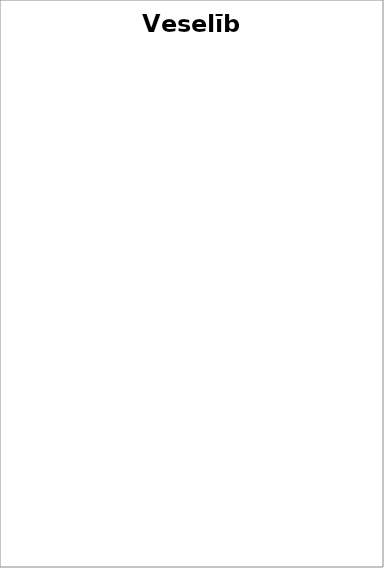
| Category | Veselība |
|---|---|
| Maksas par veselības aprūpes pakalpojumiem ko sniedz ārstniecības iestādes | 0 |
| Sociālās drošības tīkla pasākumi | 0 |
| Neatliekamā medicīnas palīdzība | 0.035 |
| Sabiedrības veselības dienestu pakalpojumi | 0.037 |
| Medikamentu un materiālu iegāde, KF militāro pensionāru aprūpe, ē-veselība un interešu izglītība | 0.048 |
| Veselības aprūpe amatpersonām ar speciālajām dienesta pakāpēm | 0.094 |
| Infekcijas slimību specifiskā diagnostika, ārstēšana un profilakse | 0.1 |
| Kompensējamie un retie medikamenti | 0.103 |
| Sporta medicīnas nodrošināšana | 0.21 |